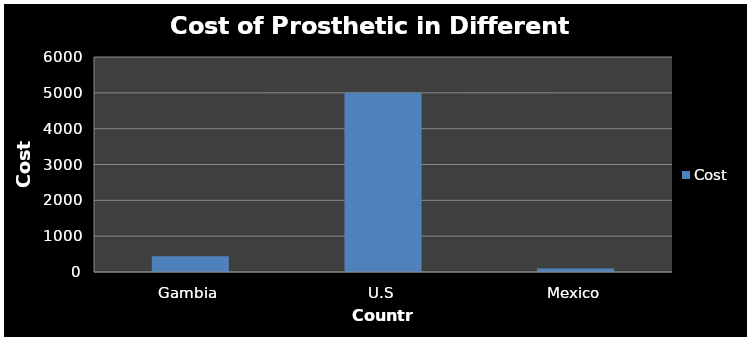
| Category | Cost |
|---|---|
| Gambia | 443 |
| U.S | 5000 |
| Mexico | 100 |